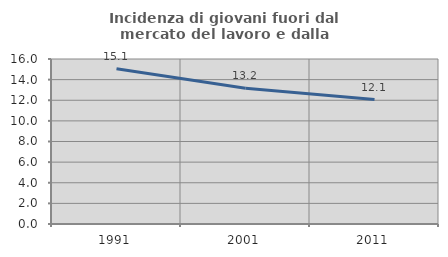
| Category | Incidenza di giovani fuori dal mercato del lavoro e dalla formazione  |
|---|---|
| 1991.0 | 15.064 |
| 2001.0 | 13.163 |
| 2011.0 | 12.065 |